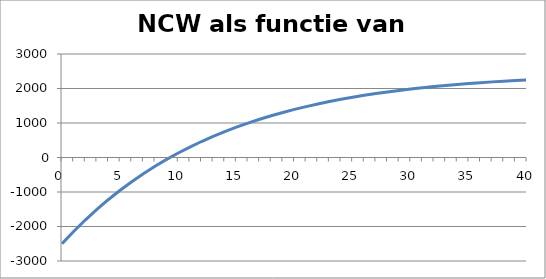
| Category | Series 0 |
|---|---|
| 0.0 | -2500 |
| 1.0 | -2143.868 |
| 2.0 | -1812.344 |
| 3.0 | -1503.784 |
| 4.0 | -1216.65 |
| 5.0 | -949.505 |
| 6.0 | -701.007 |
| 7.0 | -469.899 |
| 8.0 | -255.011 |
| 9.0 | -55.245 |
| 10.0 | 130.421 |
| 11.0 | 302.944 |
| 12.0 | 463.217 |
| 13.0 | 612.073 |
| 14.0 | 750.292 |
| 15.0 | 878.601 |
| 16.0 | 997.679 |
| 17.0 | 1108.16 |
| 18.0 | 1210.636 |
| 19.0 | 1305.658 |
| 20.0 | 1393.743 |
| 21.0 | 1475.371 |
| 22.0 | 1550.991 |
| 23.0 | 1621.022 |
| 24.0 | 1685.854 |
| 25.0 | 1745.851 |
| 26.0 | 1801.353 |
| 27.0 | 1852.677 |
| 28.0 | 1900.117 |
| 29.0 | 1943.949 |
| 30.0 | 1984.43 |
| 31.0 | 2021.798 |
| 32.0 | 2056.276 |
| 33.0 | 2088.071 |
| 34.0 | 2117.378 |
| 35.0 | 2144.374 |
| 36.0 | 2169.229 |
| 37.0 | 2192.099 |
| 38.0 | 2213.127 |
| 39.0 | 2232.45 |
| 40.0 | 2250.193 |